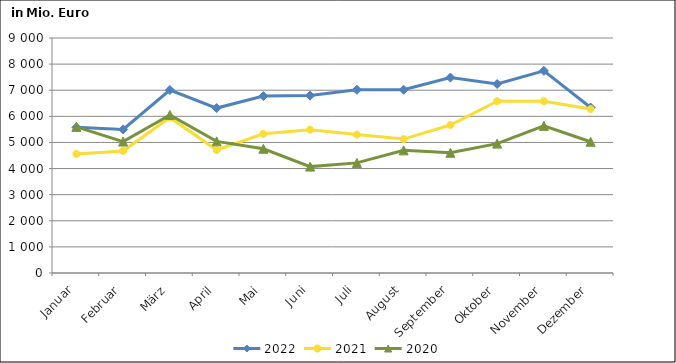
| Category | 2022 | 2021 | 2020 |
|---|---|---|---|
| Januar | 5578.401 | 4558.706 | 5595.2 |
| Februar | 5498.44 | 4673.66 | 5033.629 |
| März | 7008.152 | 5958.617 | 6053.217 |
| April | 6316.243 | 4711.185 | 5041.534 |
| Mai | 6774.12 | 5329.247 | 4757.333 |
| Juni | 6793.78 | 5489.574 | 4074.337 |
| Juli | 7017.639 | 5299.955 | 4217.05 |
| August | 7019.993 | 5128.51 | 4696.346 |
| September | 7485.168 | 5666.535 | 4603.912 |
| Oktober | 7238.378 | 6582.428 | 4955.224 |
| November | 7740.98 | 6580.115 | 5634.035 |
| Dezember | 6338.114 | 6277.924 | 5025.402 |